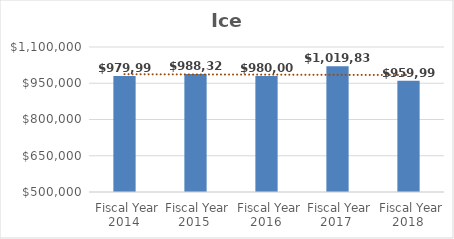
| Category | Ice Arena |
|---|---|
| Fiscal Year 2014 | 979999 |
| Fiscal Year 2015 | 988326 |
| Fiscal Year 2016 | 980000 |
| Fiscal Year 2017 | 1019839 |
| Fiscal Year 2018 | 959999 |